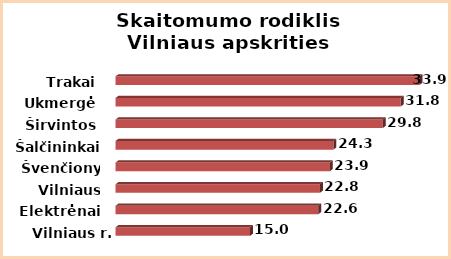
| Category | Series 0 |
|---|---|
| Vilniaus r. | 15 |
| Elektrėnai | 22.6 |
| Vilniaus m. | 22.8 |
| Švenčionys | 23.9 |
| Šalčininkai | 24.3 |
| Širvintos | 29.8 |
| Ukmergė | 31.8 |
| Trakai | 33.9 |